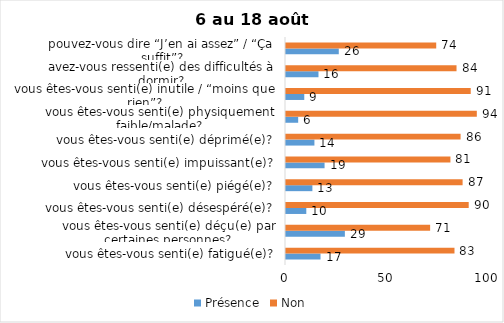
| Category | Présence | Non |
|---|---|---|
| vous êtes-vous senti(e) fatigué(e)? | 17 | 83 |
| vous êtes-vous senti(e) déçu(e) par certaines personnes? | 29 | 71 |
| vous êtes-vous senti(e) désespéré(e)? | 10 | 90 |
| vous êtes-vous senti(e) piégé(e)? | 13 | 87 |
| vous êtes-vous senti(e) impuissant(e)? | 19 | 81 |
| vous êtes-vous senti(e) déprimé(e)? | 14 | 86 |
| vous êtes-vous senti(e) physiquement faible/malade? | 6 | 94 |
| vous êtes-vous senti(e) inutile / “moins que rien”? | 9 | 91 |
| avez-vous ressenti(e) des difficultés à dormir? | 16 | 84 |
| pouvez-vous dire “J’en ai assez” / “Ça suffit”? | 26 | 74 |